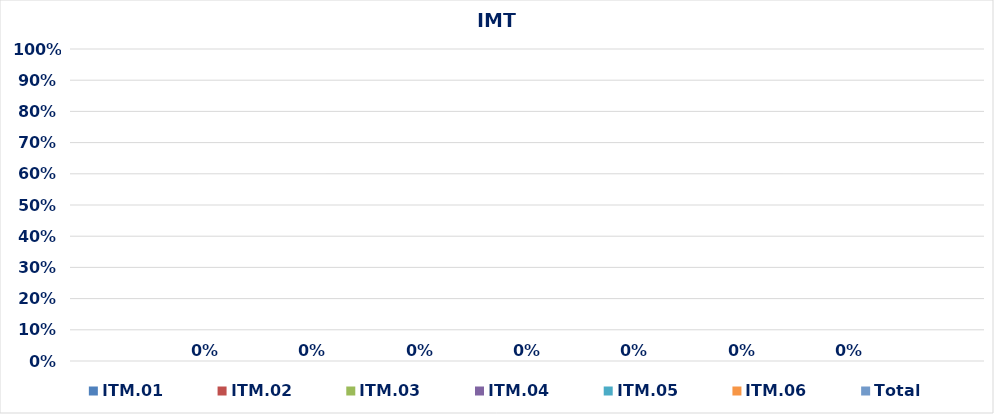
| Category | ITM.01 | ITM.02 | ITM.03 | ITM.04 | ITM.05 | ITM.06 | Total |
|---|---|---|---|---|---|---|---|
| 0 | 0 | 0 | 0 | 0 | 0 | 0 | 0 |